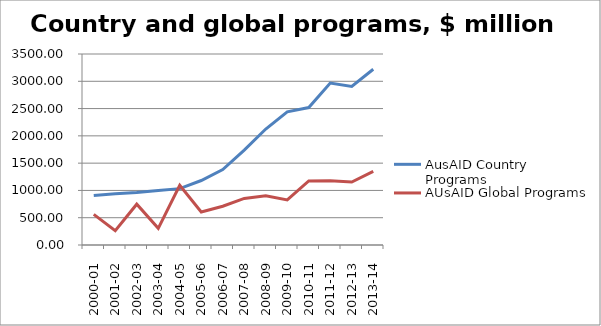
| Category | AusAID Country Programs | AUsAID Global Programs |
|---|---|---|
| 2000-01 | 907.4 | 561.1 |
| 2001-02 | 938.3 | 263.7 |
| 2002-03 | 963.6 | 748 |
| 2003-04 | 999.2 | 305.9 |
| 2004-05 | 1032.8 | 1093.9 |
| 2005-06 | 1181.8 | 605.2 |
| 2006-07 | 1381.6 | 710.8 |
| 2007-08 | 1738.4 | 853.9 |
| 2008-09 | 2125.1 | 903.2 |
| 2009-10 | 2439.7 | 825.3 |
| 2010-11 | 2518.8 | 1174 |
| 2011-12 | 2966.6 | 1175.6 |
| 2012-13 | 2905.5 | 1154.8 |
| 2013-14 | 3221 | 1348.3 |